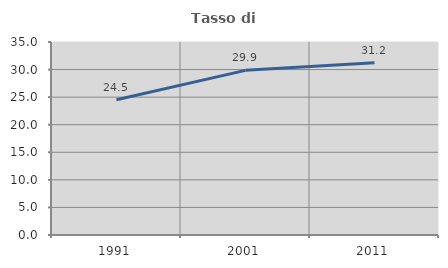
| Category | Tasso di occupazione   |
|---|---|
| 1991.0 | 24.516 |
| 2001.0 | 29.858 |
| 2011.0 | 31.217 |